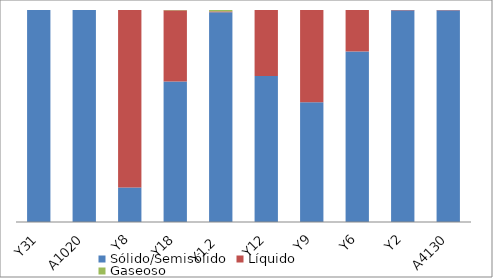
| Category | Sólido/Semisólido | Líquido | Gaseoso |
|---|---|---|---|
| Y31 | 5054362.57 | 20 | 0 |
| A1020 | 2739043.6 | 140 | 0 |
| Y8 | 286493.34 | 1472126.3 | 0 |
| Y18 | 1094688.66 | 555411 | 2429.75 |
| Y1.2 | 1045489.75 | 4291.9 | 6873.1 |
| Y12 | 551370.46 | 249019.35 | 0 |
| Y9 | 447286.29 | 343900.76 | 0 |
| Y6 | 315072.57 | 76610.53 | 0 |
| Y2 | 345955.35 | 603.6 | 0 |
| A4130 | 325288.22 | 465 | 1.53 |